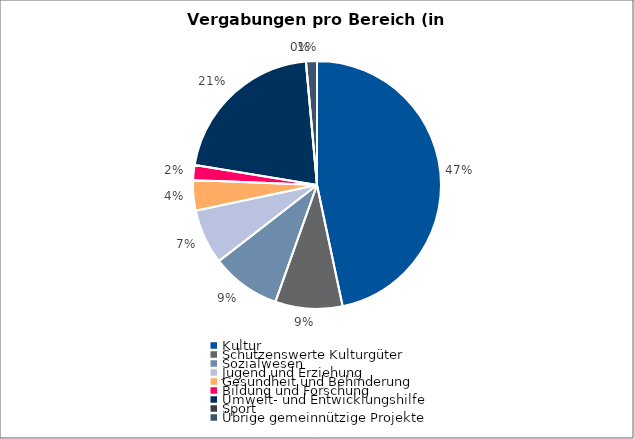
| Category | Series 0 |
|---|---|
| Kultur | 4494775 |
| Schützenswerte Kulturgüter | 844223 |
| Sozialwesen | 871501 |
| Jugend und Erziehung | 691600 |
| Gesundheit und Behinderung | 380500 |
| Bildung und Forschung | 187501 |
| Umwelt- und Entwicklungshilfe | 2021391 |
| Sport | 0 |
| Übrige gemeinnützige Projekte | 137469 |